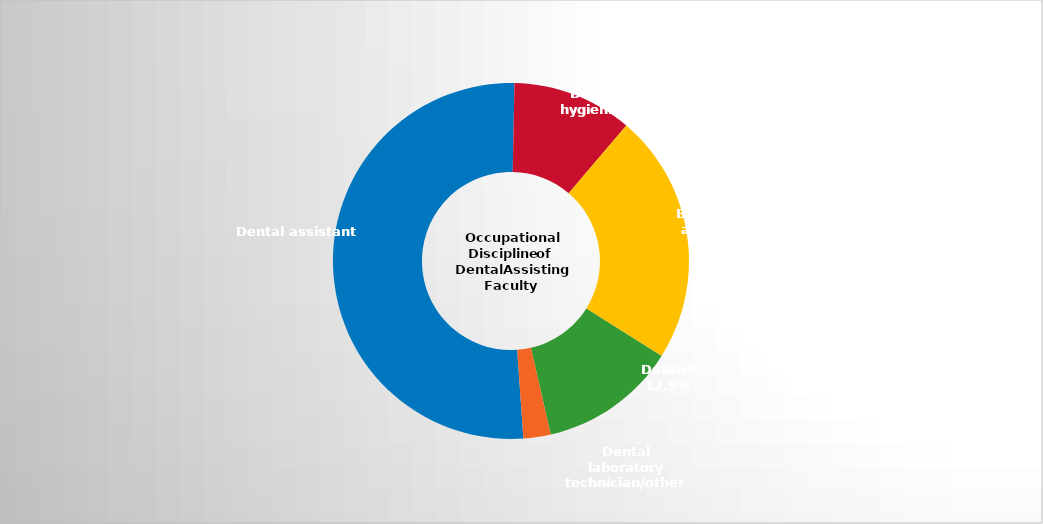
| Category | Series 2 |
|---|---|
| Dental assistant   | 0.514 |
| Dental hygienist | 0.109 |
| Both dental hygienist and dental assistant | 0.227 |
| Dentist | 0.125 |
| Dental laboratory technician/other | 0.025 |